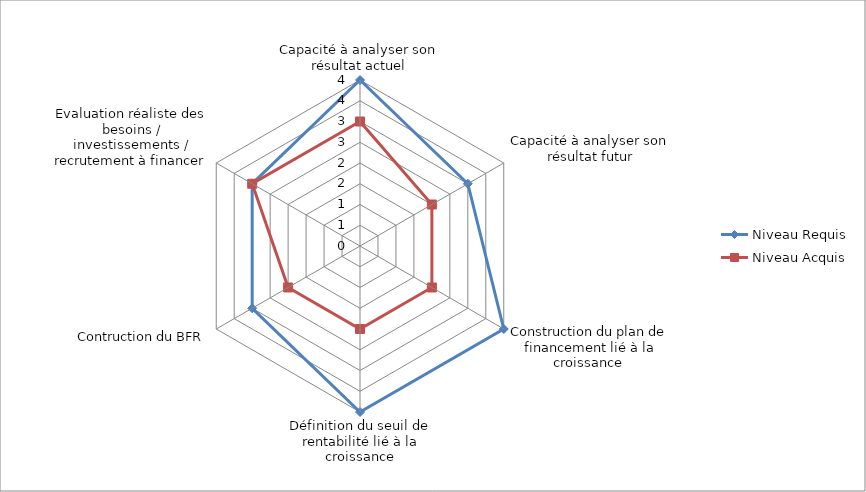
| Category | Niveau Requis | Niveau Acquis |
|---|---|---|
| Capacité à analyser son résultat actuel | 4 | 3 |
| Capacité à analyser son résultat futur | 3 | 2 |
| Construction du plan de financement lié à la croissance  | 4 | 2 |
| Définition du seuil de rentabilité lié à la croissance | 4 | 2 |
| Contruction du BFR | 3 | 2 |
| Evaluation réaliste des besoins / investissements / recrutement à financer | 3 | 3 |